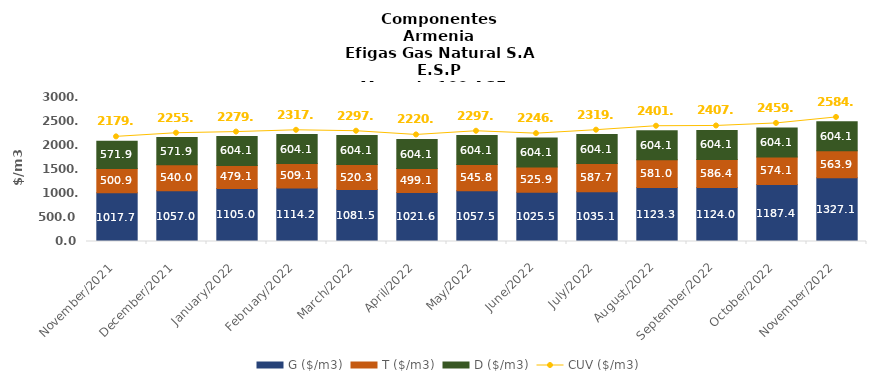
| Category | G ($/m3) | T ($/m3) | D ($/m3) |
|---|---|---|---|
| 2021-11-01 | 1017.67 | 500.87 | 571.94 |
| 2021-12-01 | 1057.02 | 540.03 | 571.94 |
| 2022-01-01 | 1104.95 | 479.06 | 604.09 |
| 2022-02-01 | 1114.19 | 509.07 | 604.09 |
| 2022-03-01 | 1081.46 | 520.29 | 604.09 |
| 2022-04-01 | 1021.55 | 499.13 | 604.09 |
| 2022-05-01 | 1057.51 | 545.79 | 604.09 |
| 2022-06-01 | 1025.45 | 525.86 | 604.09 |
| 2022-07-01 | 1035.13 | 587.69 | 604.09 |
| 2022-08-01 | 1123.29 | 581.03 | 604.09 |
| 2022-09-01 | 1123.97 | 586.38 | 604.09 |
| 2022-10-01 | 1187.44 | 574.12 | 604.09 |
| 2022-11-01 | 1327.14 | 563.85 | 604.09 |